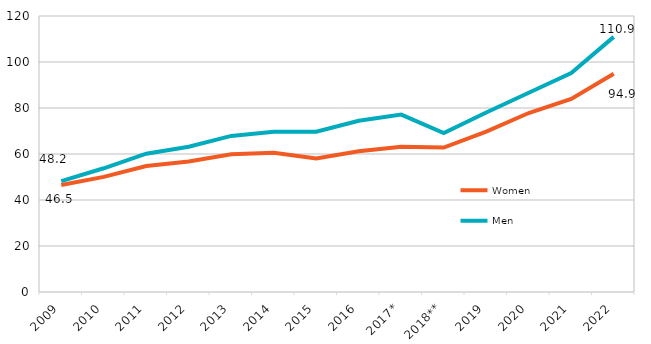
| Category | Women | Men |
|---|---|---|
| 2009 | 46.489 | 48.197 |
| 2010 | 50.049 | 53.792 |
| 2011 | 54.792 | 60.148 |
| 2012 | 56.765 | 63.157 |
| 2013 | 59.891 | 67.86 |
| 2014 | 60.498 | 69.624 |
| 2015 | 58.063 | 69.725 |
| 2016 | 61.203 | 74.447 |
| 2017* | 63.153 | 77.143 |
| 2018** | 62.792 | 69.12 |
| 2019 | 69.73 | 78.029 |
| 2020 | 77.826 | 86.622 |
| 2021 | 83.908 | 95.178 |
| 2022 | 94.911 | 110.915 |